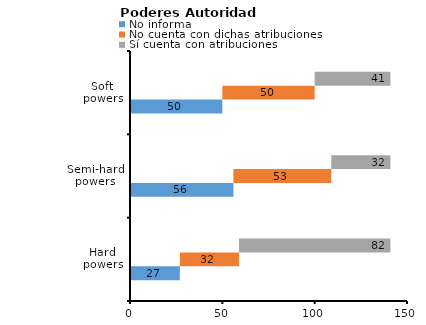
| Category | No informa | No cuenta con dichas atribuciones | Sí cuenta con atribuciones |
|---|---|---|---|
| Hard powers | 27 | 32 | 82 |
| Semi-hard powers | 56 | 53 | 32 |
| Soft powers | 50 | 50 | 41 |